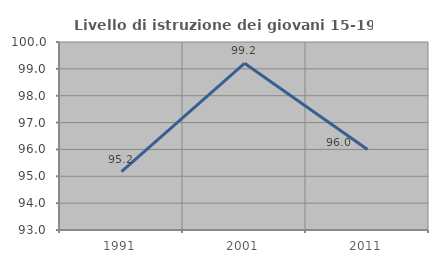
| Category | Livello di istruzione dei giovani 15-19 anni |
|---|---|
| 1991.0 | 95.169 |
| 2001.0 | 99.206 |
| 2011.0 | 96 |